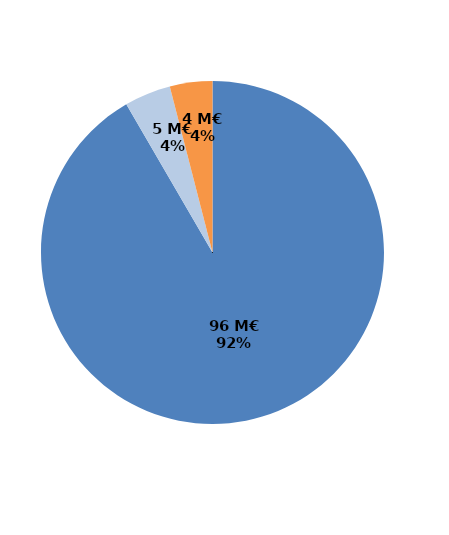
| Category | Series 0 |
|---|---|
| Formations certifiantes et pré-certifiantes | 95.734 |
| Formations professionnalisantes | 4.573 |
| Formations d'insertion sociale et professionnelle | 4.186 |